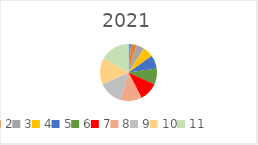
| Category | Series 0 | Series 1 |
|---|---|---|
| 0 | 1 | 1535897.74 |
| 1 | 2 | 101962.04 |
| 2 | 3 | 5983776.42 |
| 3 | 4 | 1067117.37 |
| 4 | 5 | 0 |
| 5 | 6 | 0 |
| 6 | 7 | 13898.62 |
| 7 | 8 | 0 |
| 8 | 9 | 12684.61 |
| 9 | 10 | 285061.38 |
| 10 | 11 | 91258.46 |